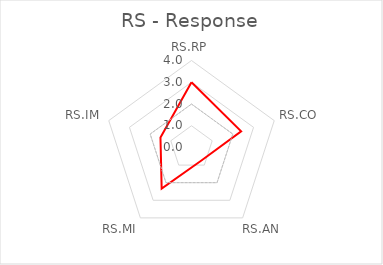
| Category | Series 0 | Series 1 |
|---|---|---|
| RS.RP | 3 | 1.997 |
| RS.CO | 2.4 | 1.997 |
| RS.AN | 0.75 | 1.997 |
| RS.MI | 2.333 | 1.997 |
| RS.IM | 1.5 | 1.997 |